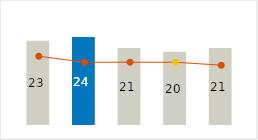
| Category | Power & Fuel |
|---|---|
| 0 | 23 |
| 1 | 24 |
| 2 | 21 |
| 3 | 20 |
| 4 | 21 |